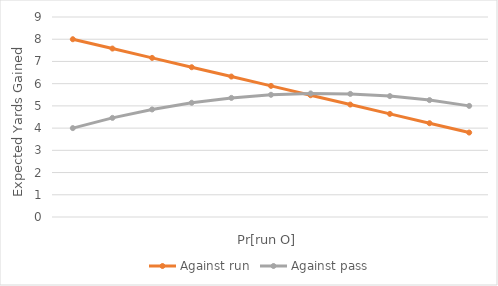
| Category | Against run | Against pass |
|---|---|---|
| 0 | 8 | 4 |
| 1 | 7.58 | 4.46 |
| 2 | 7.16 | 4.84 |
| 3 | 6.74 | 5.14 |
| 4 | 6.32 | 5.36 |
| 5 | 5.9 | 5.5 |
| 6 | 5.48 | 5.56 |
| 7 | 5.06 | 5.54 |
| 8 | 4.64 | 5.44 |
| 9 | 4.22 | 5.26 |
| 10 | 3.8 | 5 |